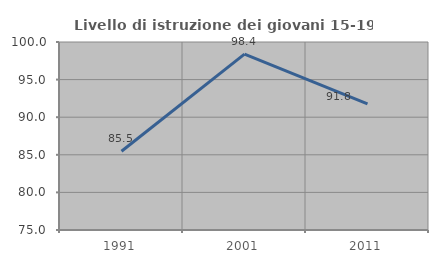
| Category | Livello di istruzione dei giovani 15-19 anni |
|---|---|
| 1991.0 | 85.473 |
| 2001.0 | 98.387 |
| 2011.0 | 91.765 |